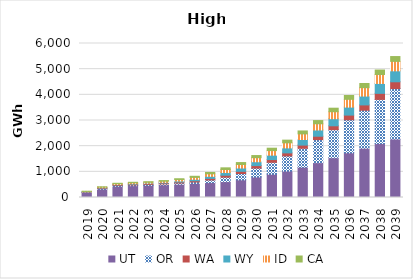
| Category | UT | OR | WA | WY | ID | CA |
|---|---|---|---|---|---|---|
| 2019.0 | 194.331 | 16.118 | 11.915 | 4.441 | 9.23 | 7.97 |
| 2020.0 | 329.362 | 21.877 | 22.386 | 9.77 | 19.462 | 13.444 |
| 2021.0 | 439.646 | 26.186 | 28.657 | 14.59 | 26.547 | 18.466 |
| 2022.0 | 460.021 | 29.045 | 32.371 | 17.745 | 31.791 | 21.506 |
| 2023.0 | 472.982 | 31.444 | 33.428 | 19.812 | 34.582 | 22.763 |
| 2024.0 | 492.069 | 37.108 | 35.869 | 26.395 | 42.404 | 25.572 |
| 2025.0 | 519.142 | 44.852 | 39.959 | 38.734 | 55.561 | 32.816 |
| 2026.0 | 548.531 | 56.026 | 47.253 | 57.451 | 73.692 | 43.722 |
| 2027.0 | 582.088 | 101.791 | 60.449 | 80.965 | 97.193 | 54.529 |
| 2028.0 | 618.221 | 174.704 | 74.422 | 105.17 | 118.716 | 64.559 |
| 2029.0 | 687.676 | 247.024 | 85.829 | 127.999 | 138.225 | 74.386 |
| 2030.0 | 798.588 | 348.393 | 96.919 | 148.703 | 158.468 | 83.348 |
| 2031.0 | 905.763 | 465.905 | 107.13 | 170.635 | 178.235 | 92.97 |
| 2032.0 | 1030.024 | 592.046 | 116.219 | 193.928 | 198.259 | 103.793 |
| 2033.0 | 1180.571 | 737.048 | 124.411 | 216.894 | 219.912 | 113.627 |
| 2034.0 | 1358.464 | 896.714 | 132.223 | 242.534 | 242.934 | 124.318 |
| 2035.0 | 1549.853 | 1092.626 | 151.18 | 276.445 | 272.395 | 136.81 |
| 2036.0 | 1741.596 | 1287.84 | 180.849 | 311.645 | 303.137 | 149.412 |
| 2037.0 | 1922.342 | 1478.875 | 206.029 | 344.065 | 327.976 | 161.39 |
| 2038.0 | 2101.29 | 1721.139 | 235.441 | 385.135 | 348.399 | 174.615 |
| 2039.0 | 2280.237 | 1963.403 | 264.853 | 426.22 | 368.822 | 187.841 |